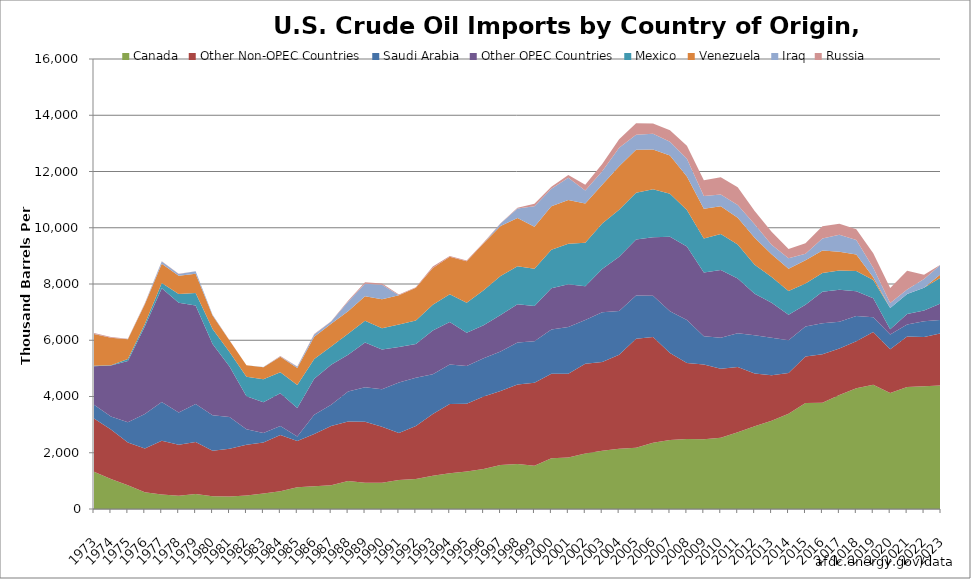
| Category | Canada | Other Non-OPEC Countries | Saudi Arabia | Other OPEC Countries | Mexico | Venezuela | Iraq | Russia |
|---|---|---|---|---|---|---|---|---|
| 1973.0 | 1324.844 | 1896.697 | 485.748 | 1368.057 | 15.663 | 1134.912 | 4.189 | 26.036 |
| 1974.0 | 1069.504 | 1758.376 | 461.255 | 1815.974 | 8.477 | 979.096 | 0 | 19.501 |
| 1975.0 | 846.438 | 1522.119 | 714.614 | 2181.713 | 71.419 | 702.468 | 2.468 | 14.474 |
| 1976.0 | 599.27 | 1549.855 | 1229.773 | 3109.858 | 87.153 | 700.09 | 26.071 | 10.527 |
| 1977.0 | 516.929 | 1906.271 | 1380.386 | 4048.672 | 179.427 | 690.359 | 73.682 | 11.523 |
| 1978.0 | 466.764 | 1819.219 | 1143.899 | 3899.945 | 317.814 | 645.501 | 62.118 | 8.151 |
| 1979.0 | 537.685 | 1840.683 | 1355.677 | 3503.869 | 439.049 | 690.09 | 87.814 | 1.26 |
| 1980.0 | 454.538 | 1620.666 | 1260.56 | 2530.02 | 533.068 | 481.243 | 28.219 | 0.71 |
| 1981.0 | 447.138 | 1697.872 | 1129.296 | 1787.983 | 522.495 | 406.058 | 0 | 4.832 |
| 1982.0 | 482.229 | 1799.694 | 551.953 | 1179.188 | 684.856 | 411.824 | 2.67 | 0.745 |
| 1983.0 | 547.152 | 1814.293 | 337.235 | 1092.561 | 826.471 | 422.018 | 10.296 | 1.328 |
| 1984.0 | 629.845 | 1997.037 | 324.832 | 1163.287 | 748.161 | 548.001 | 12.443 | 13.377 |
| 1985.0 | 770 | 1643.408 | 167.629 | 1011.294 | 815.895 | 604.84 | 46.271 | 7.806 |
| 1986.0 | 806.611 | 1863.328 | 684.907 | 1277.454 | 698.603 | 793.065 | 81.126 | 18.419 |
| 1987.0 | 848.086 | 2103.805 | 751.279 | 1422.056 | 654.707 | 804.289 | 82.797 | 10.677 |
| 1988.0 | 999.372 | 2107.3 | 1073.385 | 1306.721 | 746.911 | 794.093 | 345.478 | 28.76 |
| 1989.0 | 931.367 | 2174.502 | 1224.312 | 1593.625 | 767.036 | 872.726 | 449.375 | 47.603 |
| 1990.0 | 933.858 | 1987.505 | 1339.227 | 1414.195 | 755.052 | 1024.627 | 518.096 | 44.962 |
| 1991.0 | 1032.679 | 1666.224 | 1801.556 | 1255.583 | 806.841 | 1034.899 | 0 | 28.964 |
| 1992.0 | 1069.096 | 1878.696 | 1720.077 | 1201.748 | 830.153 | 1169.784 | 0 | 18.142 |
| 1993.0 | 1181.321 | 2192.307 | 1413.723 | 1559.337 | 918.584 | 1300.403 | 0 | 54.748 |
| 1994.0 | 1272.101 | 2462.983 | 1402.496 | 1510.778 | 983.929 | 1333.721 | 0 | 30.214 |
| 1995.0 | 1332.137 | 2408.754 | 1343.8 | 1177.552 | 1067.581 | 1480.263 | 0 | 24.852 |
| 1996.0 | 1423.773 | 2573.954 | 1362.65 | 1171.42 | 1244.279 | 1675.984 | 1.156 | 25.276 |
| 1997.0 | 1563.293 | 2631.53 | 1407.378 | 1299.198 | 1385.233 | 1772.863 | 89.123 | 12.945 |
| 1998.0 | 1598.433 | 2829.415 | 1491.236 | 1359.448 | 1351.137 | 1718.948 | 335.666 | 23.789 |
| 1999.0 | 1539.4 | 2946.326 | 1478.252 | 1256.613 | 1324.342 | 1492.597 | 725.381 | 89.345 |
| 2000.0 | 1806.97 | 3004.525 | 1571.787 | 1465.15 | 1372.975 | 1546.079 | 619.683 | 72.082 |
| 2001.0 | 1828.422 | 2984.783 | 1662.337 | 1518.167 | 1439.882 | 1553.414 | 794.515 | 89.816 |
| 2002.0 | 1970.778 | 3197.612 | 1552.088 | 1195.554 | 1546.567 | 1398.252 | 459.282 | 210.11 |
| 2003.0 | 2072.203 | 3153.113 | 1774.427 | 1529.937 | 1623.195 | 1376.241 | 481.268 | 254.003 |
| 2004.0 | 2138.246 | 3343.356 | 1557.751 | 1932.213 | 1664.549 | 1554.492 | 656.26 | 298.227 |
| 2005.0 | 2181.422 | 3872.881 | 1536.501 | 1989.921 | 1662.332 | 1529.197 | 531.471 | 410.085 |
| 2006.0 | 2352.984 | 3763.249 | 1463.405 | 2081.224 | 1705.227 | 1419.033 | 553.058 | 368.893 |
| 2007.0 | 2454.729 | 3087.66 | 1484.896 | 2649.938 | 1532.34 | 1360.778 | 484.134 | 413.901 |
| 2008.0 | 2492.522 | 2701.629 | 1529.372 | 2609.907 | 1301.546 | 1188.604 | 626.503 | 465.202 |
| 2009.0 | 2479.216 | 2662.685 | 1004.397 | 2258.425 | 1209.995 | 1062.619 | 450.293 | 563.082 |
| 2010.0 | 2535.419 | 2455.052 | 1096.238 | 2406.957 | 1284.466 | 987.742 | 415.395 | 611.973 |
| 2011.0 | 2728.789 | 2321.797 | 1194.575 | 1950.743 | 1206.17 | 950.655 | 459.425 | 624.038 |
| 2012.0 | 2946.481 | 1868.477 | 1365.014 | 1470.978 | 1034.678 | 959.617 | 475.628 | 477.082 |
| 2013.0 | 3141.649 | 1617.822 | 1328.586 | 1244.696 | 918.666 | 806.189 | 340.83 | 460.34 |
| 2014.0 | 3387.559 | 1444.839 | 1166.49 | 912.11 | 841.852 | 789.389 | 368.882 | 329.712 |
| 2015.0 | 3764.901 | 1660.909 | 1058.918 | 778.77 | 757.795 | 827.367 | 229.386 | 370.54 |
| 2016.0 | 3780.071 | 1719.847 | 1106.352 | 1119.038 | 669.112 | 796.342 | 423.831 | 440.672 |
| 2017.0 | 4054.449 | 1652.519 | 955.126 | 1132.674 | 682.356 | 673.918 | 604.107 | 389.071 |
| 2018.0 | 4291.781 | 1668.26 | 900.647 | 880.178 | 719.488 | 585.89 | 521.321 | 375.37 |
| 2019.0 | 4419.896 | 1870.014 | 529.745 | 675.638 | 650.414 | 92.03 | 340.504 | 514.959 |
| 2020.0 | 4123.46 | 1560.074 | 522.09 | 188.22 | 749.36 | 0 | 177.25 | 538.2 |
| 2021.0 | 4340 | 1790 | 430 | 374 | 711 | 0 | 157 | 673 |
| 2022.0 | 4365 | 1755 | 559 | 383 | 808 | 0 | 311 | 147 |
| 2023.0 | 4394 | 1855 | 477 | 587 | 918 | 125 | 344 | 0 |